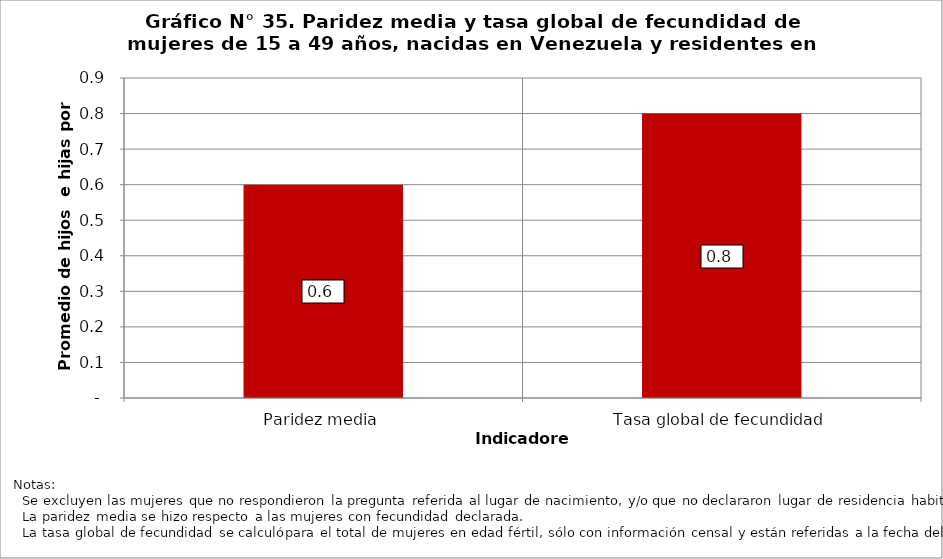
| Category | Venezuela |
|---|---|
| Paridez media | 0.6 |
| Tasa global de fecundidad | 0.8 |